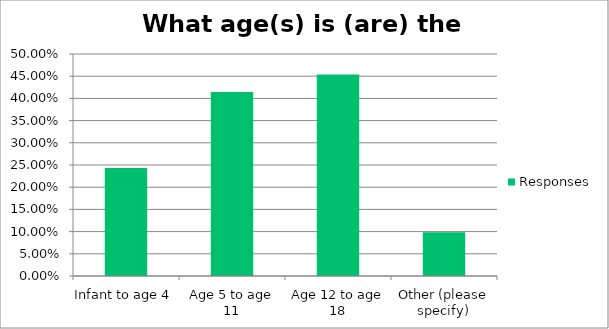
| Category | Responses |
|---|---|
| Infant to age 4 | 0.243 |
| Age 5 to age 11 | 0.414 |
| Age 12 to age 18 | 0.454 |
| Other (please specify) | 0.099 |